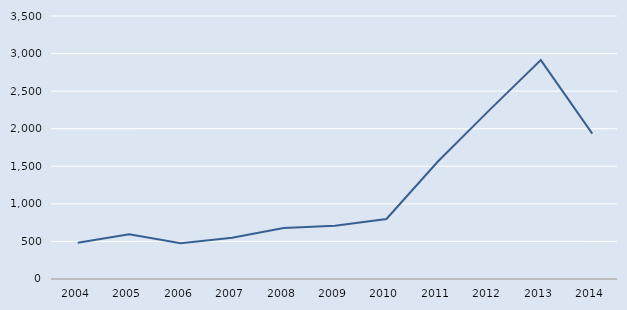
| Category | Series 0 |
|---|---|
| 2004.0 | 482 |
| 2005.0 | 595 |
| 2006.0 | 477 |
| 2007.0 | 550 |
| 2008.0 | 679 |
| 2009.0 | 708 |
| 2010.0 | 798 |
| 2011.0 | 1564 |
| 2012.0 | 2247 |
| 2013.0 | 2913 |
| 2014.0 | 1934 |